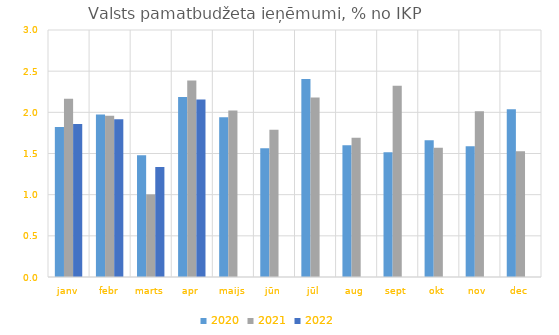
| Category | 2020 | 2021 | 2022 |
|---|---|---|---|
| janv | 1.822 | 2.166 | 1.857 |
| febr | 1.972 | 1.959 | 1.916 |
| marts | 1.478 | 1.004 | 1.335 |
| apr | 2.186 | 2.387 | 2.155 |
| maijs | 1.941 | 2.021 | 0 |
| jūn | 1.564 | 1.79 | 0 |
| jūl | 2.406 | 2.18 | 0 |
| aug | 1.601 | 1.693 | 0 |
| sept | 1.514 | 2.323 | 0 |
| okt | 1.662 | 1.57 | 0 |
| nov | 1.588 | 2.013 | 0 |
| dec | 2.038 | 1.527 | 0 |